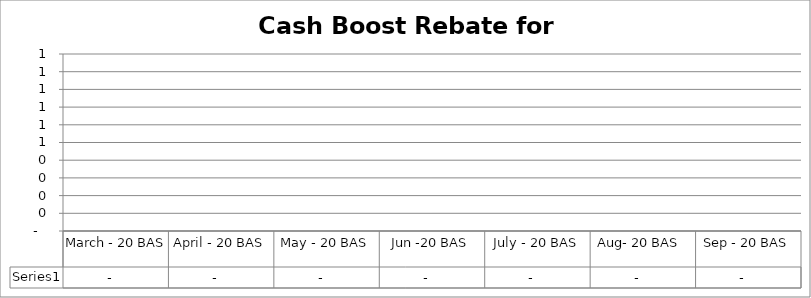
| Category | Series 0 |
|---|---|
| March - 20 BAS | 0 |
| April - 20 BAS | 0 |
| May - 20 BAS | 0 |
| Jun -20 BAS | 0 |
| July - 20 BAS | 0 |
| Aug- 20 BAS  | 0 |
| Sep - 20 BAS | 0 |